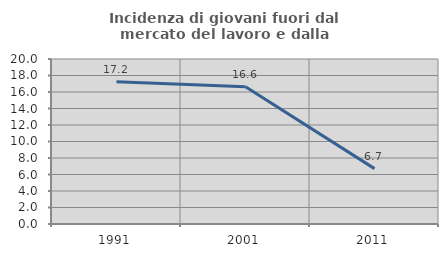
| Category | Incidenza di giovani fuori dal mercato del lavoro e dalla formazione  |
|---|---|
| 1991.0 | 17.229 |
| 2001.0 | 16.634 |
| 2011.0 | 6.713 |